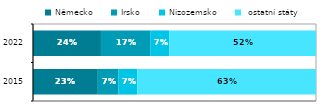
| Category | Německo | Irsko | Nizozemsko |  ostatní státy |
|---|---|---|---|---|
|  2015 | 0.229 | 0.072 | 0.067 | 0.631 |
| 2022 | 0.24 | 0.174 | 0.068 | 0.518 |